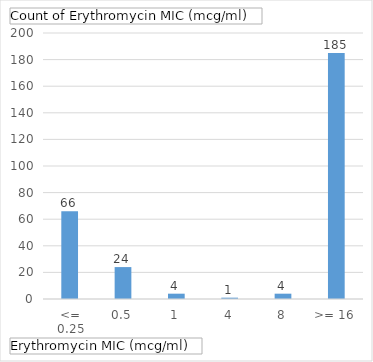
| Category | Total |
|---|---|
| <= 0.25 | 66 |
| 0.5 | 24 |
| 1 | 4 |
| 4 | 1 |
| 8 | 4 |
| >= 16 | 185 |